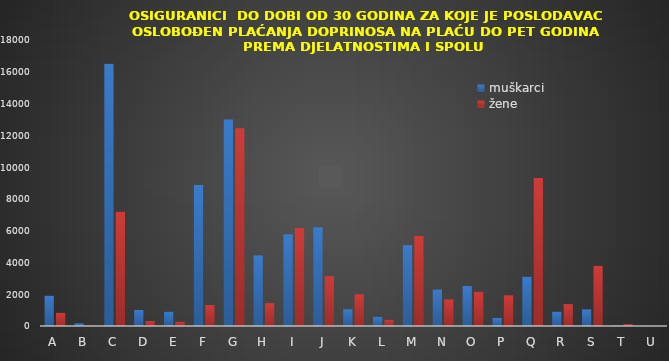
| Category | muškarci | žene |
|---|---|---|
| A | 1906 | 830 |
| B | 165 | 21 |
| C | 16504 | 7183 |
| D | 1006 | 307 |
| E | 899 | 266 |
| F | 8868 | 1314 |
| G | 13004 | 12439 |
| H | 4442 | 1438 |
| I | 5780 | 6160 |
| J | 6217 | 3135 |
| K | 1054 | 1994 |
| L | 584 | 397 |
| M | 5084 | 5675 |
| N | 2297 | 1672 |
| O | 2515 | 2158 |
| P | 503 | 1931 |
| Q | 3102 | 9308 |
| R | 903 | 1377 |
| S | 1045 | 3788 |
| T | 22 | 113 |
| U | 9 | 9 |